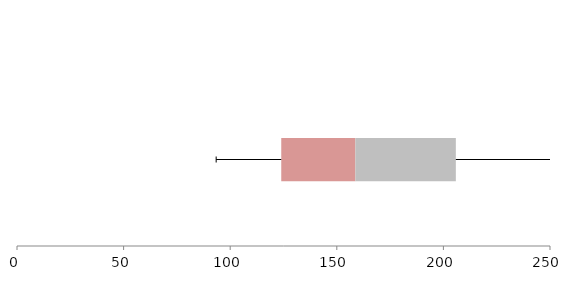
| Category | Series 1 | Series 2 | Series 3 |
|---|---|---|---|
| 0 | 123.948 | 34.767 | 47.122 |